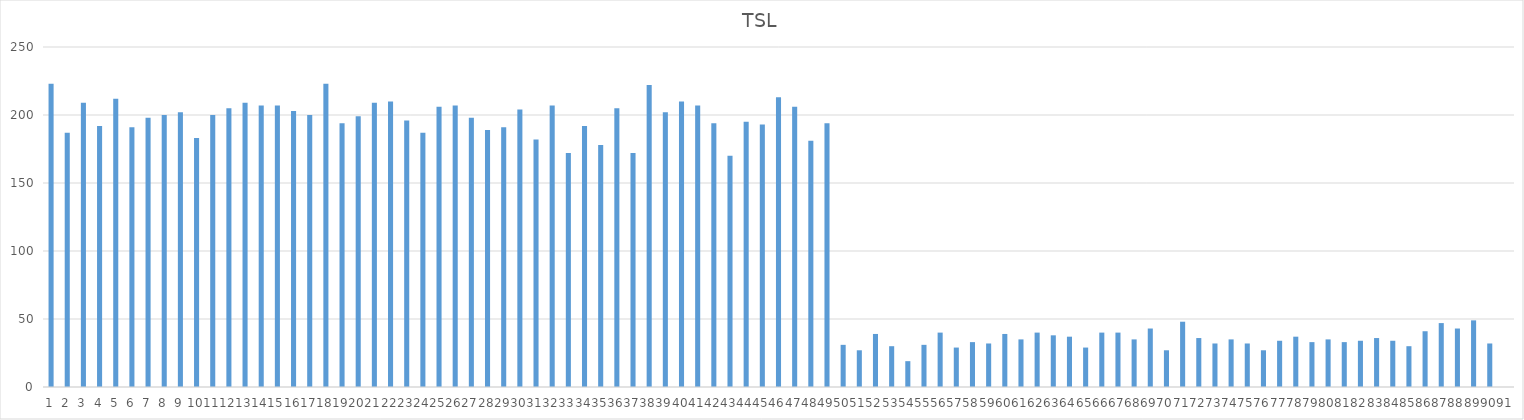
| Category | Series 0 |
|---|---|
| 0 | 223 |
| 1 | 187 |
| 2 | 209 |
| 3 | 192 |
| 4 | 212 |
| 5 | 191 |
| 6 | 198 |
| 7 | 200 |
| 8 | 202 |
| 9 | 183 |
| 10 | 200 |
| 11 | 205 |
| 12 | 209 |
| 13 | 207 |
| 14 | 207 |
| 15 | 203 |
| 16 | 200 |
| 17 | 223 |
| 18 | 194 |
| 19 | 199 |
| 20 | 209 |
| 21 | 210 |
| 22 | 196 |
| 23 | 187 |
| 24 | 206 |
| 25 | 207 |
| 26 | 198 |
| 27 | 189 |
| 28 | 191 |
| 29 | 204 |
| 30 | 182 |
| 31 | 207 |
| 32 | 172 |
| 33 | 192 |
| 34 | 178 |
| 35 | 205 |
| 36 | 172 |
| 37 | 222 |
| 38 | 202 |
| 39 | 210 |
| 40 | 207 |
| 41 | 194 |
| 42 | 170 |
| 43 | 195 |
| 44 | 193 |
| 45 | 213 |
| 46 | 206 |
| 47 | 181 |
| 48 | 194 |
| 49 | 31 |
| 50 | 27 |
| 51 | 39 |
| 52 | 30 |
| 53 | 19 |
| 54 | 31 |
| 55 | 40 |
| 56 | 29 |
| 57 | 33 |
| 58 | 32 |
| 59 | 39 |
| 60 | 35 |
| 61 | 40 |
| 62 | 38 |
| 63 | 37 |
| 64 | 29 |
| 65 | 40 |
| 66 | 40 |
| 67 | 35 |
| 68 | 43 |
| 69 | 27 |
| 70 | 48 |
| 71 | 36 |
| 72 | 32 |
| 73 | 35 |
| 74 | 32 |
| 75 | 27 |
| 76 | 34 |
| 77 | 37 |
| 78 | 33 |
| 79 | 35 |
| 80 | 33 |
| 81 | 34 |
| 82 | 36 |
| 83 | 34 |
| 84 | 30 |
| 85 | 41 |
| 86 | 47 |
| 87 | 43 |
| 88 | 49 |
| 89 | 32 |
| 90 | 0 |